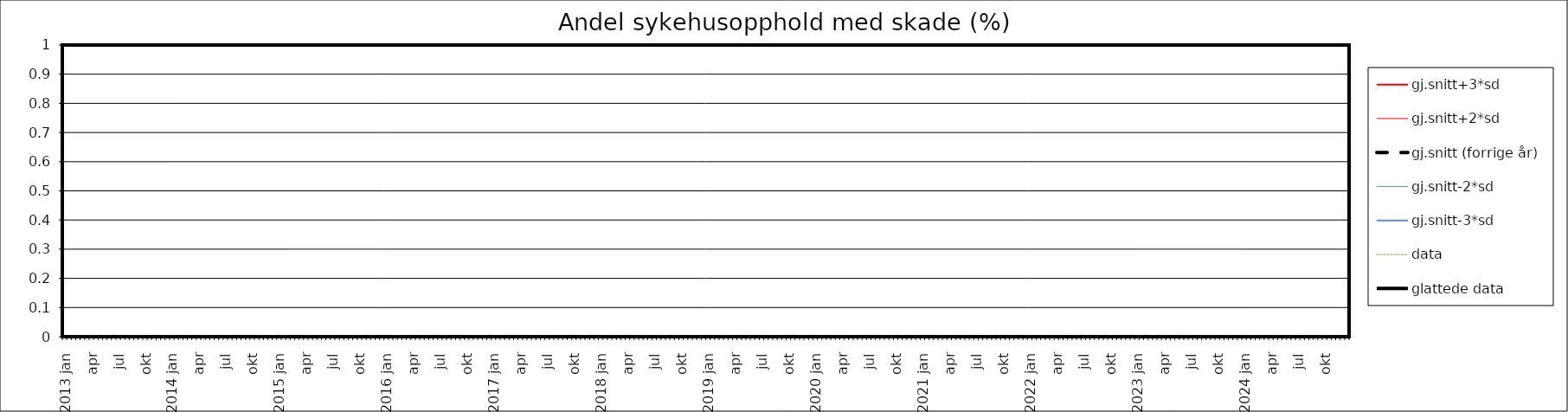
| Category | gj.snitt+3*sd | gj.snitt+2*sd | gj.snitt (forrige år) | gj.snitt-2*sd | gj.snitt-3*sd | data | glattede data |
|---|---|---|---|---|---|---|---|
| 2013 jan | 0 | 0 | 0 | 0 | 0 | 0 | 0 |
|  | 0 | 0 | 0 | 0 | 0 | 0 | 0 |
| feb | 0 | 0 | 0 | 0 | 0 | 0 | 0 |
|  | 0 | 0 | 0 | 0 | 0 | 0 | 0 |
| mar | 0 | 0 | 0 | 0 | 0 | 0 | 0 |
|  | 0 | 0 | 0 | 0 | 0 | 0 | 0 |
| apr | 0 | 0 | 0 | 0 | 0 | 0 | 0 |
|  | 0 | 0 | 0 | 0 | 0 | 0 | 0 |
| mai | 0 | 0 | 0 | 0 | 0 | 0 | 0 |
|  | 0 | 0 | 0 | 0 | 0 | 0 | 0 |
| jun | 0 | 0 | 0 | 0 | 0 | 0 | 0 |
|  | 0 | 0 | 0 | 0 | 0 | 0 | 0 |
| jul | 0 | 0 | 0 | 0 | 0 | 0 | 0 |
|  | 0 | 0 | 0 | 0 | 0 | 0 | 0 |
| aug | 0 | 0 | 0 | 0 | 0 | 0 | 0 |
|  | 0 | 0 | 0 | 0 | 0 | 0 | 0 |
| sep | 0 | 0 | 0 | 0 | 0 | 0 | 0 |
|  | 0 | 0 | 0 | 0 | 0 | 0 | 0 |
| okt | 0 | 0 | 0 | 0 | 0 | 0 | 0 |
|  | 0 | 0 | 0 | 0 | 0 | 0 | 0 |
| nov | 0 | 0 | 0 | 0 | 0 | 0 | 0 |
|  | 0 | 0 | 0 | 0 | 0 | 0 | 0 |
| des | 0 | 0 | 0 | 0 | 0 | 0 | 0 |
|  | 0 | 0 | 0 | 0 | 0 | 0 | 0 |
| 2014 jan | 0 | 0 | 0 | 0 | 0 | 0 | 0 |
|  | 0 | 0 | 0 | 0 | 0 | 0 | 0 |
| feb | 0 | 0 | 0 | 0 | 0 | 0 | 0 |
|  | 0 | 0 | 0 | 0 | 0 | 0 | 0 |
| mar | 0 | 0 | 0 | 0 | 0 | 0 | 0 |
|  | 0 | 0 | 0 | 0 | 0 | 0 | 0 |
| apr | 0 | 0 | 0 | 0 | 0 | 0 | 0 |
|  | 0 | 0 | 0 | 0 | 0 | 0 | 0 |
| mai | 0 | 0 | 0 | 0 | 0 | 0 | 0 |
|  | 0 | 0 | 0 | 0 | 0 | 0 | 0 |
| jun | 0 | 0 | 0 | 0 | 0 | 0 | 0 |
|  | 0 | 0 | 0 | 0 | 0 | 0 | 0 |
| jul | 0 | 0 | 0 | 0 | 0 | 0 | 0 |
|  | 0 | 0 | 0 | 0 | 0 | 0 | 0 |
| aug | 0 | 0 | 0 | 0 | 0 | 0 | 0 |
|  | 0 | 0 | 0 | 0 | 0 | 0 | 0 |
| sep | 0 | 0 | 0 | 0 | 0 | 0 | 0 |
|  | 0 | 0 | 0 | 0 | 0 | 0 | 0 |
| okt | 0 | 0 | 0 | 0 | 0 | 0 | 0 |
|  | 0 | 0 | 0 | 0 | 0 | 0 | 0 |
| nov | 0 | 0 | 0 | 0 | 0 | 0 | 0 |
|  | 0 | 0 | 0 | 0 | 0 | 0 | 0 |
| des | 0 | 0 | 0 | 0 | 0 | 0 | 0 |
|  | 0 | 0 | 0 | 0 | 0 | 0 | 0 |
| 2015 jan | 0 | 0 | 0 | 0 | 0 | 0 | 0 |
|  | 0 | 0 | 0 | 0 | 0 | 0 | 0 |
| feb | 0 | 0 | 0 | 0 | 0 | 0 | 0 |
|  | 0 | 0 | 0 | 0 | 0 | 0 | 0 |
| mar | 0 | 0 | 0 | 0 | 0 | 0 | 0 |
|  | 0 | 0 | 0 | 0 | 0 | 0 | 0 |
| apr | 0 | 0 | 0 | 0 | 0 | 0 | 0 |
|  | 0 | 0 | 0 | 0 | 0 | 0 | 0 |
| mai | 0 | 0 | 0 | 0 | 0 | 0 | 0 |
|  | 0 | 0 | 0 | 0 | 0 | 0 | 0 |
| jun | 0 | 0 | 0 | 0 | 0 | 0 | 0 |
|  | 0 | 0 | 0 | 0 | 0 | 0 | 0 |
| jul | 0 | 0 | 0 | 0 | 0 | 0 | 0 |
|  | 0 | 0 | 0 | 0 | 0 | 0 | 0 |
| aug | 0 | 0 | 0 | 0 | 0 | 0 | 0 |
|  | 0 | 0 | 0 | 0 | 0 | 0 | 0 |
| sep | 0 | 0 | 0 | 0 | 0 | 0 | 0 |
|  | 0 | 0 | 0 | 0 | 0 | 0 | 0 |
| okt | 0 | 0 | 0 | 0 | 0 | 0 | 0 |
|  | 0 | 0 | 0 | 0 | 0 | 0 | 0 |
| nov | 0 | 0 | 0 | 0 | 0 | 0 | 0 |
|  | 0 | 0 | 0 | 0 | 0 | 0 | 0 |
| des | 0 | 0 | 0 | 0 | 0 | 0 | 0 |
|  | 0 | 0 | 0 | 0 | 0 | 0 | 0 |
| 2016 jan | 0 | 0 | 0 | 0 | 0 | 0 | 0 |
|  | 0 | 0 | 0 | 0 | 0 | 0 | 0 |
| feb | 0 | 0 | 0 | 0 | 0 | 0 | 0 |
|  | 0 | 0 | 0 | 0 | 0 | 0 | 0 |
| mar | 0 | 0 | 0 | 0 | 0 | 0 | 0 |
|  | 0 | 0 | 0 | 0 | 0 | 0 | 0 |
| apr | 0 | 0 | 0 | 0 | 0 | 0 | 0 |
|  | 0 | 0 | 0 | 0 | 0 | 0 | 0 |
| mai | 0 | 0 | 0 | 0 | 0 | 0 | 0 |
|  | 0 | 0 | 0 | 0 | 0 | 0 | 0 |
| jun | 0 | 0 | 0 | 0 | 0 | 0 | 0 |
|  | 0 | 0 | 0 | 0 | 0 | 0 | 0 |
| jul | 0 | 0 | 0 | 0 | 0 | 0 | 0 |
|  | 0 | 0 | 0 | 0 | 0 | 0 | 0 |
| aug | 0 | 0 | 0 | 0 | 0 | 0 | 0 |
|  | 0 | 0 | 0 | 0 | 0 | 0 | 0 |
| sep | 0 | 0 | 0 | 0 | 0 | 0 | 0 |
|  | 0 | 0 | 0 | 0 | 0 | 0 | 0 |
| okt | 0 | 0 | 0 | 0 | 0 | 0 | 0 |
|  | 0 | 0 | 0 | 0 | 0 | 0 | 0 |
| nov | 0 | 0 | 0 | 0 | 0 | 0 | 0 |
|  | 0 | 0 | 0 | 0 | 0 | 0 | 0 |
| des | 0 | 0 | 0 | 0 | 0 | 0 | 0 |
|  | 0 | 0 | 0 | 0 | 0 | 0 | 0 |
| 2017 jan | 0 | 0 | 0 | 0 | 0 | 0 | 0 |
|  | 0 | 0 | 0 | 0 | 0 | 0 | 0 |
| feb | 0 | 0 | 0 | 0 | 0 | 0 | 0 |
|  | 0 | 0 | 0 | 0 | 0 | 0 | 0 |
| mar | 0 | 0 | 0 | 0 | 0 | 0 | 0 |
|  | 0 | 0 | 0 | 0 | 0 | 0 | 0 |
| apr | 0 | 0 | 0 | 0 | 0 | 0 | 0 |
|  | 0 | 0 | 0 | 0 | 0 | 0 | 0 |
| mai | 0 | 0 | 0 | 0 | 0 | 0 | 0 |
|  | 0 | 0 | 0 | 0 | 0 | 0 | 0 |
| jun | 0 | 0 | 0 | 0 | 0 | 0 | 0 |
|  | 0 | 0 | 0 | 0 | 0 | 0 | 0 |
| jul | 0 | 0 | 0 | 0 | 0 | 0 | 0 |
|  | 0 | 0 | 0 | 0 | 0 | 0 | 0 |
| aug | 0 | 0 | 0 | 0 | 0 | 0 | 0 |
|  | 0 | 0 | 0 | 0 | 0 | 0 | 0 |
| sep | 0 | 0 | 0 | 0 | 0 | 0 | 0 |
|  | 0 | 0 | 0 | 0 | 0 | 0 | 0 |
| okt | 0 | 0 | 0 | 0 | 0 | 0 | 0 |
|  | 0 | 0 | 0 | 0 | 0 | 0 | 0 |
| nov | 0 | 0 | 0 | 0 | 0 | 0 | 0 |
|  | 0 | 0 | 0 | 0 | 0 | 0 | 0 |
| des | 0 | 0 | 0 | 0 | 0 | 0 | 0 |
|  | 0 | 0 | 0 | 0 | 0 | 0 | 0 |
| 2018 jan | 0 | 0 | 0 | 0 | 0 | 0 | 0 |
|  | 0 | 0 | 0 | 0 | 0 | 0 | 0 |
| feb | 0 | 0 | 0 | 0 | 0 | 0 | 0 |
|  | 0 | 0 | 0 | 0 | 0 | 0 | 0 |
| mar | 0 | 0 | 0 | 0 | 0 | 0 | 0 |
|  | 0 | 0 | 0 | 0 | 0 | 0 | 0 |
| apr | 0 | 0 | 0 | 0 | 0 | 0 | 0 |
|  | 0 | 0 | 0 | 0 | 0 | 0 | 0 |
| mai | 0 | 0 | 0 | 0 | 0 | 0 | 0 |
|  | 0 | 0 | 0 | 0 | 0 | 0 | 0 |
| jun | 0 | 0 | 0 | 0 | 0 | 0 | 0 |
|  | 0 | 0 | 0 | 0 | 0 | 0 | 0 |
| jul | 0 | 0 | 0 | 0 | 0 | 0 | 0 |
|  | 0 | 0 | 0 | 0 | 0 | 0 | 0 |
| aug | 0 | 0 | 0 | 0 | 0 | 0 | 0 |
|  | 0 | 0 | 0 | 0 | 0 | 0 | 0 |
| sep | 0 | 0 | 0 | 0 | 0 | 0 | 0 |
|  | 0 | 0 | 0 | 0 | 0 | 0 | 0 |
| okt | 0 | 0 | 0 | 0 | 0 | 0 | 0 |
|  | 0 | 0 | 0 | 0 | 0 | 0 | 0 |
| nov | 0 | 0 | 0 | 0 | 0 | 0 | 0 |
|  | 0 | 0 | 0 | 0 | 0 | 0 | 0 |
| des | 0 | 0 | 0 | 0 | 0 | 0 | 0 |
|  | 0 | 0 | 0 | 0 | 0 | 0 | 0 |
| 2019 jan | 0 | 0 | 0 | 0 | 0 | 0 | 0 |
|  | 0 | 0 | 0 | 0 | 0 | 0 | 0 |
| feb | 0 | 0 | 0 | 0 | 0 | 0 | 0 |
|  | 0 | 0 | 0 | 0 | 0 | 0 | 0 |
| mar | 0 | 0 | 0 | 0 | 0 | 0 | 0 |
|  | 0 | 0 | 0 | 0 | 0 | 0 | 0 |
| apr | 0 | 0 | 0 | 0 | 0 | 0 | 0 |
|  | 0 | 0 | 0 | 0 | 0 | 0 | 0 |
| mai | 0 | 0 | 0 | 0 | 0 | 0 | 0 |
|  | 0 | 0 | 0 | 0 | 0 | 0 | 0 |
| jun | 0 | 0 | 0 | 0 | 0 | 0 | 0 |
|  | 0 | 0 | 0 | 0 | 0 | 0 | 0 |
| jul | 0 | 0 | 0 | 0 | 0 | 0 | 0 |
|  | 0 | 0 | 0 | 0 | 0 | 0 | 0 |
| aug | 0 | 0 | 0 | 0 | 0 | 0 | 0 |
|  | 0 | 0 | 0 | 0 | 0 | 0 | 0 |
| sep | 0 | 0 | 0 | 0 | 0 | 0 | 0 |
|  | 0 | 0 | 0 | 0 | 0 | 0 | 0 |
| okt | 0 | 0 | 0 | 0 | 0 | 0 | 0 |
|  | 0 | 0 | 0 | 0 | 0 | 0 | 0 |
| nov | 0 | 0 | 0 | 0 | 0 | 0 | 0 |
|  | 0 | 0 | 0 | 0 | 0 | 0 | 0 |
| des | 0 | 0 | 0 | 0 | 0 | 0 | 0 |
|  | 0 | 0 | 0 | 0 | 0 | 0 | 0 |
| 2020 jan | 0 | 0 | 0 | 0 | 0 | 0 | 0 |
|  | 0 | 0 | 0 | 0 | 0 | 0 | 0 |
| feb | 0 | 0 | 0 | 0 | 0 | 0 | 0 |
|  | 0 | 0 | 0 | 0 | 0 | 0 | 0 |
| mar | 0 | 0 | 0 | 0 | 0 | 0 | 0 |
|  | 0 | 0 | 0 | 0 | 0 | 0 | 0 |
| apr | 0 | 0 | 0 | 0 | 0 | 0 | 0 |
|  | 0 | 0 | 0 | 0 | 0 | 0 | 0 |
| mai | 0 | 0 | 0 | 0 | 0 | 0 | 0 |
|  | 0 | 0 | 0 | 0 | 0 | 0 | 0 |
| jun | 0 | 0 | 0 | 0 | 0 | 0 | 0 |
|  | 0 | 0 | 0 | 0 | 0 | 0 | 0 |
| jul | 0 | 0 | 0 | 0 | 0 | 0 | 0 |
|  | 0 | 0 | 0 | 0 | 0 | 0 | 0 |
| aug | 0 | 0 | 0 | 0 | 0 | 0 | 0 |
|  | 0 | 0 | 0 | 0 | 0 | 0 | 0 |
| sep | 0 | 0 | 0 | 0 | 0 | 0 | 0 |
|  | 0 | 0 | 0 | 0 | 0 | 0 | 0 |
| okt | 0 | 0 | 0 | 0 | 0 | 0 | 0 |
|  | 0 | 0 | 0 | 0 | 0 | 0 | 0 |
| nov | 0 | 0 | 0 | 0 | 0 | 0 | 0 |
|  | 0 | 0 | 0 | 0 | 0 | 0 | 0 |
| des | 0 | 0 | 0 | 0 | 0 | 0 | 0 |
|  | 0 | 0 | 0 | 0 | 0 | 0 | 0 |
| 2021 jan | 0 | 0 | 0 | 0 | 0 | 0 | 0 |
|  | 0 | 0 | 0 | 0 | 0 | 0 | 0 |
| feb | 0 | 0 | 0 | 0 | 0 | 0 | 0 |
|  | 0 | 0 | 0 | 0 | 0 | 0 | 0 |
| mar | 0 | 0 | 0 | 0 | 0 | 0 | 0 |
|  | 0 | 0 | 0 | 0 | 0 | 0 | 0 |
| apr | 0 | 0 | 0 | 0 | 0 | 0 | 0 |
|  | 0 | 0 | 0 | 0 | 0 | 0 | 0 |
| mai | 0 | 0 | 0 | 0 | 0 | 0 | 0 |
|  | 0 | 0 | 0 | 0 | 0 | 0 | 0 |
| jun | 0 | 0 | 0 | 0 | 0 | 0 | 0 |
|  | 0 | 0 | 0 | 0 | 0 | 0 | 0 |
| jul | 0 | 0 | 0 | 0 | 0 | 0 | 0 |
|  | 0 | 0 | 0 | 0 | 0 | 0 | 0 |
| aug | 0 | 0 | 0 | 0 | 0 | 0 | 0 |
|  | 0 | 0 | 0 | 0 | 0 | 0 | 0 |
| sep | 0 | 0 | 0 | 0 | 0 | 0 | 0 |
|  | 0 | 0 | 0 | 0 | 0 | 0 | 0 |
| okt | 0 | 0 | 0 | 0 | 0 | 0 | 0 |
|  | 0 | 0 | 0 | 0 | 0 | 0 | 0 |
| nov | 0 | 0 | 0 | 0 | 0 | 0 | 0 |
|  | 0 | 0 | 0 | 0 | 0 | 0 | 0 |
| des | 0 | 0 | 0 | 0 | 0 | 0 | 0 |
|  | 0 | 0 | 0 | 0 | 0 | 0 | 0 |
| 2022 jan | 0 | 0 | 0 | 0 | 0 | 0 | 0 |
|  | 0 | 0 | 0 | 0 | 0 | 0 | 0 |
| feb | 0 | 0 | 0 | 0 | 0 | 0 | 0 |
|  | 0 | 0 | 0 | 0 | 0 | 0 | 0 |
| mar | 0 | 0 | 0 | 0 | 0 | 0 | 0 |
|  | 0 | 0 | 0 | 0 | 0 | 0 | 0 |
| apr | 0 | 0 | 0 | 0 | 0 | 0 | 0 |
|  | 0 | 0 | 0 | 0 | 0 | 0 | 0 |
| mai | 0 | 0 | 0 | 0 | 0 | 0 | 0 |
|  | 0 | 0 | 0 | 0 | 0 | 0 | 0 |
| jun | 0 | 0 | 0 | 0 | 0 | 0 | 0 |
|  | 0 | 0 | 0 | 0 | 0 | 0 | 0 |
| jul | 0 | 0 | 0 | 0 | 0 | 0 | 0 |
|  | 0 | 0 | 0 | 0 | 0 | 0 | 0 |
| aug | 0 | 0 | 0 | 0 | 0 | 0 | 0 |
|  | 0 | 0 | 0 | 0 | 0 | 0 | 0 |
| sep | 0 | 0 | 0 | 0 | 0 | 0 | 0 |
|  | 0 | 0 | 0 | 0 | 0 | 0 | 0 |
| okt | 0 | 0 | 0 | 0 | 0 | 0 | 0 |
|  | 0 | 0 | 0 | 0 | 0 | 0 | 0 |
| nov | 0 | 0 | 0 | 0 | 0 | 0 | 0 |
|  | 0 | 0 | 0 | 0 | 0 | 0 | 0 |
| des | 0 | 0 | 0 | 0 | 0 | 0 | 0 |
|  | 0 | 0 | 0 | 0 | 0 | 0 | 0 |
| 2023 jan | 0 | 0 | 0 | 0 | 0 | 0 | 0 |
|  | 0 | 0 | 0 | 0 | 0 | 0 | 0 |
| feb | 0 | 0 | 0 | 0 | 0 | 0 | 0 |
|  | 0 | 0 | 0 | 0 | 0 | 0 | 0 |
| mar | 0 | 0 | 0 | 0 | 0 | 0 | 0 |
|  | 0 | 0 | 0 | 0 | 0 | 0 | 0 |
| apr | 0 | 0 | 0 | 0 | 0 | 0 | 0 |
|  | 0 | 0 | 0 | 0 | 0 | 0 | 0 |
| mai | 0 | 0 | 0 | 0 | 0 | 0 | 0 |
|  | 0 | 0 | 0 | 0 | 0 | 0 | 0 |
| jun | 0 | 0 | 0 | 0 | 0 | 0 | 0 |
|  | 0 | 0 | 0 | 0 | 0 | 0 | 0 |
| jul | 0 | 0 | 0 | 0 | 0 | 0 | 0 |
|  | 0 | 0 | 0 | 0 | 0 | 0 | 0 |
| aug | 0 | 0 | 0 | 0 | 0 | 0 | 0 |
|  | 0 | 0 | 0 | 0 | 0 | 0 | 0 |
| sep | 0 | 0 | 0 | 0 | 0 | 0 | 0 |
|  | 0 | 0 | 0 | 0 | 0 | 0 | 0 |
| okt | 0 | 0 | 0 | 0 | 0 | 0 | 0 |
|  | 0 | 0 | 0 | 0 | 0 | 0 | 0 |
| nov | 0 | 0 | 0 | 0 | 0 | 0 | 0 |
|  | 0 | 0 | 0 | 0 | 0 | 0 | 0 |
| des | 0 | 0 | 0 | 0 | 0 | 0 | 0 |
|  | 0 | 0 | 0 | 0 | 0 | 0 | 0 |
| 2024 jan | 0 | 0 | 0 | 0 | 0 | 0 | 0 |
|  | 0 | 0 | 0 | 0 | 0 | 0 | 0 |
| feb | 0 | 0 | 0 | 0 | 0 | 0 | 0 |
|  | 0 | 0 | 0 | 0 | 0 | 0 | 0 |
| mar | 0 | 0 | 0 | 0 | 0 | 0 | 0 |
|  | 0 | 0 | 0 | 0 | 0 | 0 | 0 |
| apr | 0 | 0 | 0 | 0 | 0 | 0 | 0 |
|  | 0 | 0 | 0 | 0 | 0 | 0 | 0 |
| mai | 0 | 0 | 0 | 0 | 0 | 0 | 0 |
|  | 0 | 0 | 0 | 0 | 0 | 0 | 0 |
| jun | 0 | 0 | 0 | 0 | 0 | 0 | 0 |
|  | 0 | 0 | 0 | 0 | 0 | 0 | 0 |
| jul | 0 | 0 | 0 | 0 | 0 | 0 | 0 |
|  | 0 | 0 | 0 | 0 | 0 | 0 | 0 |
| aug | 0 | 0 | 0 | 0 | 0 | 0 | 0 |
|  | 0 | 0 | 0 | 0 | 0 | 0 | 0 |
| sep | 0 | 0 | 0 | 0 | 0 | 0 | 0 |
|  | 0 | 0 | 0 | 0 | 0 | 0 | 0 |
| okt | 0 | 0 | 0 | 0 | 0 | 0 | 0 |
|  | 0 | 0 | 0 | 0 | 0 | 0 | 0 |
| nov | 0 | 0 | 0 | 0 | 0 | 0 | 0 |
|  | 0 | 0 | 0 | 0 | 0 | 0 | 0 |
| des | 0 | 0 | 0 | 0 | 0 | 0 | 0 |